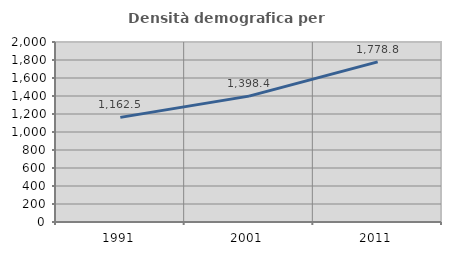
| Category | Densità demografica |
|---|---|
| 1991.0 | 1162.493 |
| 2001.0 | 1398.429 |
| 2011.0 | 1778.793 |